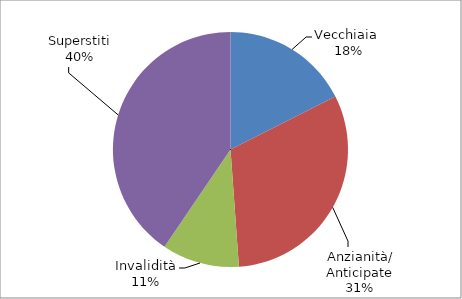
| Category | Series 0 |
|---|---|
| Vecchiaia  | 47210 |
| Anzianità/ Anticipate | 84135 |
| Invalidità | 28600 |
| Superstiti | 108890 |